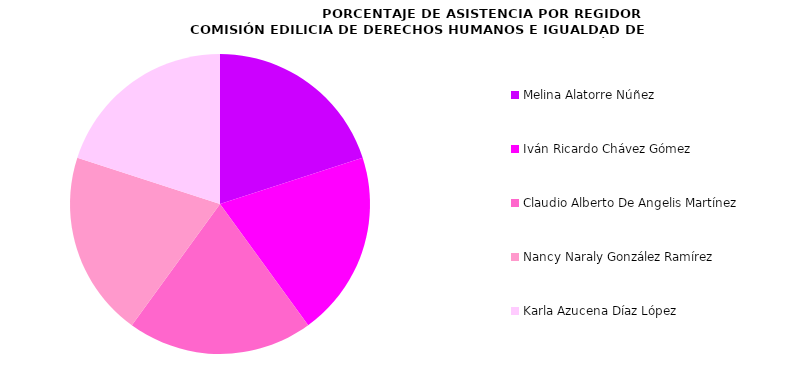
| Category | Series 0 |
|---|---|
| Melina Alatorre Núñez | 100 |
| Iván Ricardo Chávez Gómez | 100 |
| Claudio Alberto De Angelis Martínez | 100 |
| Nancy Naraly González Ramírez | 100 |
| Karla Azucena Díaz López | 100 |